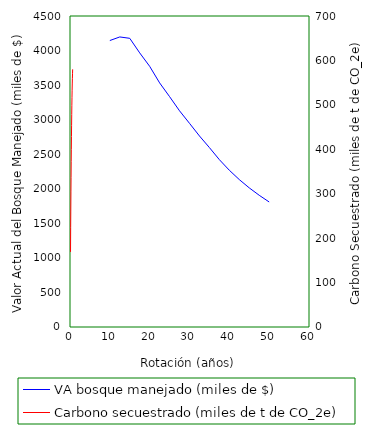
| Category | VA bosque manejado (miles de $) |
|---|---|
| 10.0 | 4145 |
| 12.5 | 4197 |
| 15.0 | 4177 |
| 17.5 | 3966 |
| 20.0 | 3772 |
| 22.5 | 3532 |
| 25.0 | 3333 |
| 27.5 | 3128 |
| 30.0 | 2947 |
| 32.5 | 2764 |
| 35.0 | 2596 |
| 37.5 | 2421 |
| 40.0 | 2268 |
| 42.5 | 2133 |
| 45.0 | 2013 |
| 47.5 | 1906 |
| 50.0 | 1809 |